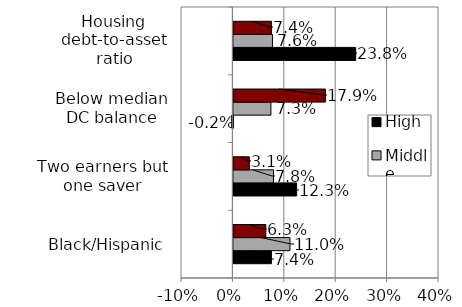
| Category | High | Middle | Low |
|---|---|---|---|
| Black/Hispanic | 0.074 | 0.11 | 0.063 |
| Two earners but one saver | 0.123 | 0.078 | 0.031 |
| Below median DC balance | -0.002 | 0.073 | 0.179 |
| Housing debt-to-asset ratio | 0.238 | 0.076 | 0.074 |